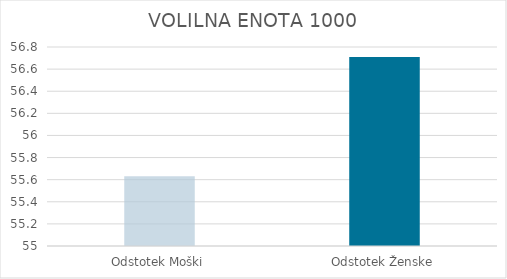
| Category | VOLILNA ENOTA 1000 |
|---|---|
| Odstotek Moški | 55.63 |
| Odstotek Ženske | 56.71 |